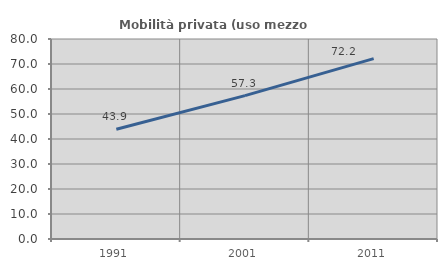
| Category | Mobilità privata (uso mezzo privato) |
|---|---|
| 1991.0 | 43.884 |
| 2001.0 | 57.34 |
| 2011.0 | 72.173 |